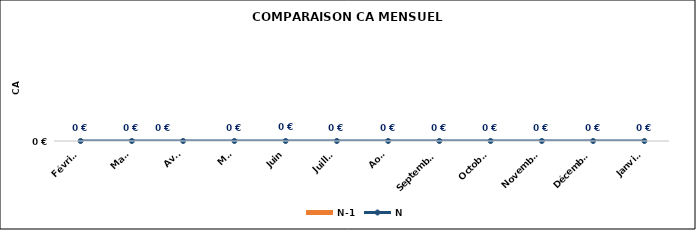
| Category | N-1 |
|---|---|
| Février | 0 |
| Mars | 0 |
| Avril | 0 |
| Mai | 0 |
| Juin | 0 |
| Juillet | 0 |
| Août | 0 |
| Septembre | 0 |
| Octobre | 0 |
| Novembre | 0 |
| Décembre | 0 |
| Janvier | 0 |